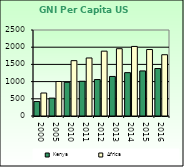
| Category | Kenya | Africa                        |
|---|---|---|
| 2000.0 | 420 | 668.557 |
| 2005.0 | 520 | 1002.896 |
| 2010.0 | 980 | 1608.999 |
| 2011.0 | 1010 | 1686.521 |
| 2012.0 | 1060 | 1885.129 |
| 2013.0 | 1150 | 1956.671 |
| 2014.0 | 1260 | 2022.289 |
| 2015.0 | 1310 | 1932.283 |
| 2016.0 | 1380 | 1781.415 |